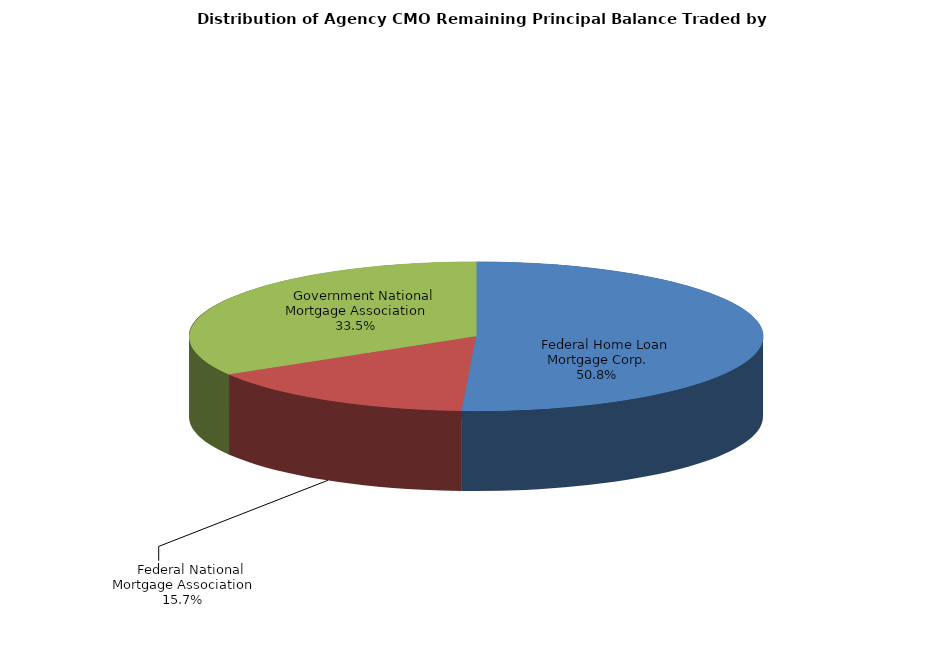
| Category | Series 0 |
|---|---|
|     Federal Home Loan Mortgage Corp. | 2253037514.785 |
|     Federal National Mortgage Association | 694710609.386 |
|     Government National Mortgage Association | 1487395726.618 |